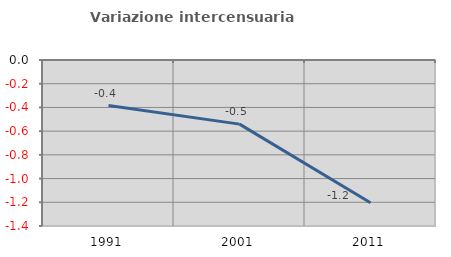
| Category | Variazione intercensuaria annua |
|---|---|
| 1991.0 | -0.385 |
| 2001.0 | -0.541 |
| 2011.0 | -1.204 |